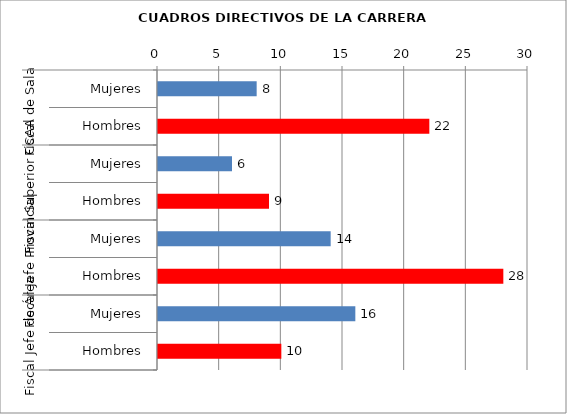
| Category | Series 0 |
|---|---|
| 0 | 8 |
| 1 | 22 |
| 2 | 6 |
| 3 | 9 |
| 4 | 14 |
| 5 | 28 |
| 6 | 16 |
| 7 | 10 |